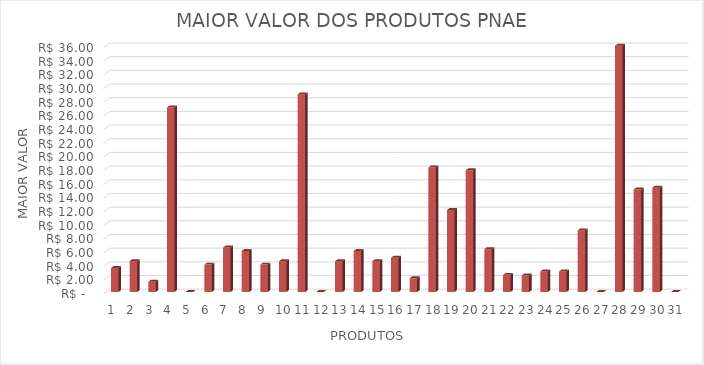
| Category | Series 0 |
|---|---|
| 0 | 3.5 |
| 1 | 4.5 |
| 2 | 1.5 |
| 3 | 27 |
| 4 | 0 |
| 5 | 4 |
| 6 | 6.5 |
| 7 | 5.99 |
| 8 | 4 |
| 9 | 4.5 |
| 10 | 28.9 |
| 11 | 0 |
| 12 | 4.5 |
| 13 | 5.99 |
| 14 | 4.5 |
| 15 | 5 |
| 16 | 2 |
| 17 | 18.2 |
| 18 | 11.99 |
| 19 | 17.8 |
| 20 | 6.25 |
| 21 | 2.5 |
| 22 | 2.4 |
| 23 | 3 |
| 24 | 3 |
| 25 | 9 |
| 26 | 0 |
| 27 | 36 |
| 28 | 15 |
| 29 | 15.25 |
| 30 | 0 |